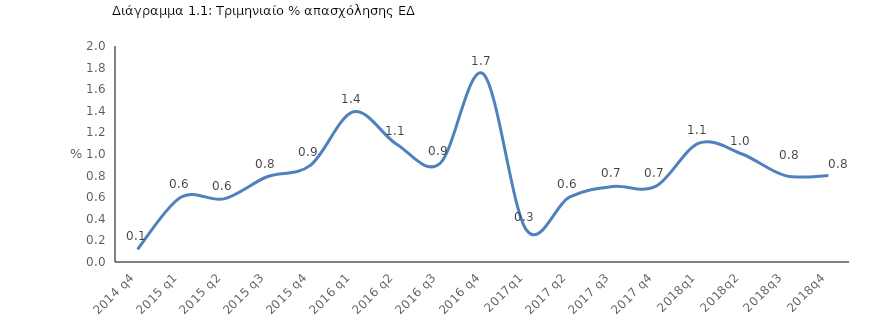
| Category | Series 0 |
|---|---|
| 2014 q4 | 0.117 |
| 2015 q1 | 0.6 |
| 2015 q2 | 0.585 |
| 2015 q3 | 0.789 |
| 2015 q4 | 0.894 |
| 2016 q1 | 1.391 |
| 2016 q2 | 1.091 |
| 2016 q3 | 0.911 |
| 2016 q4 | 1.743 |
| 2017q1 | 0.3 |
| 2017 q2 | 0.6 |
| 2017 q3 | 0.7 |
| 2017 q4 | 0.7 |
| 2018q1 | 1.1 |
| 2018q2 | 1 |
| 2018q3 | 0.8 |
| 2018q4 | 0.8 |